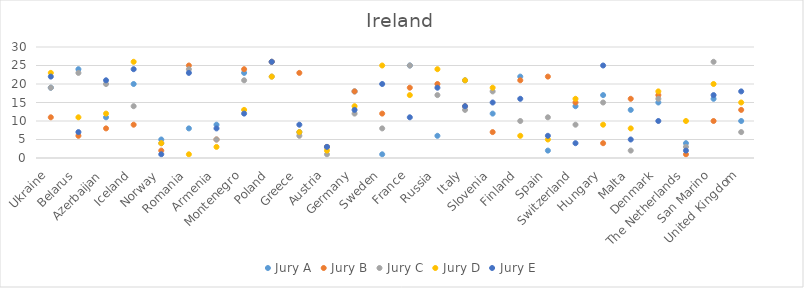
| Category | Jury A | Jury B | Jury C | Jury D | Jury E |
|---|---|---|---|---|---|
| Ukraine | 19 | 11 | 19 | 23 | 22 |
| Belarus | 24 | 6 | 23 | 11 | 7 |
| Azerbaijan | 11 | 8 | 20 | 12 | 21 |
| Iceland | 20 | 9 | 14 | 26 | 24 |
| Norway | 5 | 2 | 4 | 4 | 1 |
| Romania | 8 | 25 | 24 | 1 | 23 |
| Armenia | 9 | 5 | 5 | 3 | 8 |
| Montenegro | 23 | 24 | 21 | 13 | 12 |
| Poland | 26 | 26 | 22 | 22 | 26 |
| Greece | 7 | 23 | 6 | 7 | 9 |
| Austria | 3 | 3 | 1 | 2 | 3 |
| Germany | 18 | 18 | 12 | 14 | 13 |
| Sweden | 1 | 12 | 8 | 25 | 20 |
| France | 25 | 19 | 25 | 17 | 11 |
| Russia | 6 | 20 | 17 | 24 | 19 |
| Italy | 21 | 14 | 13 | 21 | 14 |
| Slovenia | 12 | 7 | 18 | 19 | 15 |
| Finland | 22 | 21 | 10 | 6 | 16 |
| Spain | 2 | 22 | 11 | 5 | 6 |
| Switzerland | 14 | 15 | 9 | 16 | 4 |
| Hungary | 17 | 4 | 15 | 9 | 25 |
| Malta | 13 | 16 | 2 | 8 | 5 |
| Denmark | 15 | 17 | 16 | 18 | 10 |
| The Netherlands | 4 | 1 | 3 | 10 | 2 |
| San Marino | 16 | 10 | 26 | 20 | 17 |
| United Kingdom | 10 | 13 | 7 | 15 | 18 |